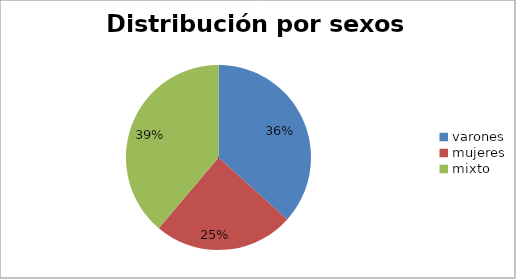
| Category | género |
|---|---|
| varones | 220 |
| mujeres | 147 |
| mixto | 233 |